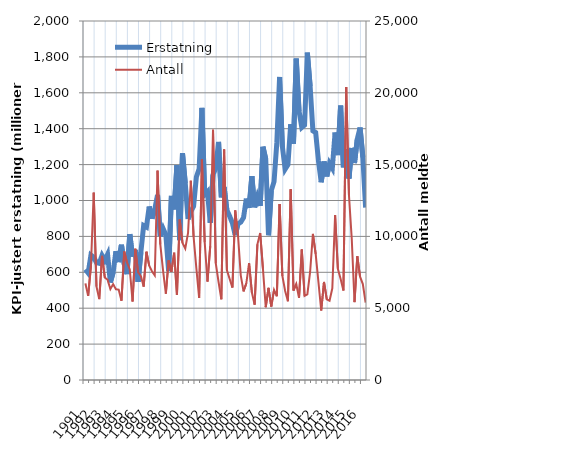
| Category | Erstatning |
|---|---|
| 1991.0 | 616.265 |
| nan | 596.168 |
| nan | 695.61 |
| nan | 683.787 |
| 1992.0 | 654.264 |
| nan | 650.086 |
| nan | 694.114 |
| nan | 666.281 |
| 1993.0 | 699.623 |
| nan | 543.342 |
| nan | 599.474 |
| nan | 717.435 |
| 1994.0 | 656.906 |
| nan | 753.578 |
| nan | 645.873 |
| nan | 589.696 |
| 1995.0 | 812.756 |
| nan | 686.966 |
| nan | 724.85 |
| nan | 546.639 |
| 1996.0 | 712.208 |
| nan | 860.409 |
| nan | 851.828 |
| nan | 966.551 |
| 1997.0 | 899.002 |
| nan | 950.697 |
| nan | 1030.685 |
| nan | 801.293 |
| 1998.0 | 844.15 |
| nan | 808.933 |
| nan | 606.267 |
| nan | 1025.385 |
| 1999.0 | 950.061 |
| nan | 1196.371 |
| nan | 779.416 |
| nan | 1263.603 |
| 2000.0 | 1095.813 |
| nan | 896.795 |
| nan | 937.576 |
| nan | 967.604 |
| 2001.0 | 1131.039 |
| nan | 1177.33 |
| nan | 1515.944 |
| nan | 1033.131 |
| 2002.0 | 1049.331 |
| nan | 875.783 |
| nan | 1142.763 |
| nan | 1182.003 |
| 2003.0 | 1326.27 |
| nan | 1018.063 |
| nan | 1074.673 |
| nan | 946.444 |
| 2004.0 | 912.797 |
| nan | 873.195 |
| nan | 807.5 |
| nan | 869.948 |
| 2005.0 | 879.375 |
| nan | 904.695 |
| nan | 1010.665 |
| nan | 959.076 |
| 2006.0 | 1135.665 |
| nan | 961.881 |
| nan | 1020.075 |
| nan | 970.376 |
| 2007.0 | 1299.486 |
| nan | 1231.02 |
| nan | 806.52 |
| nan | 1055.097 |
| 2008.0 | 1105.097 |
| nan | 1322.141 |
| nan | 1688.162 |
| nan | 1300.465 |
| 2009.0 | 1174.208 |
| nan | 1198.81 |
| nan | 1424.867 |
| nan | 1316.505 |
| 2010.0 | 1790.678 |
| nan | 1498.539 |
| nan | 1406.97 |
| nan | 1420.541 |
| 2011.0 | 1823.95 |
| nan | 1636.407 |
| nan | 1388.709 |
| nan | 1378.57 |
| 2012.0 | 1221.062 |
| nan | 1101.625 |
| nan | 1217.401 |
| nan | 1134.299 |
| 2013.0 | 1206.888 |
| nan | 1180.135 |
| nan | 1378.612 |
| nan | 1252.996 |
| 2014.0 | 1528.653 |
| nan | 1185.046 |
| nan | 1285.623 |
| nan | 1122.101 |
| 2015.0 | 1292.782 |
| nan | 1208.47 |
| nan | 1342.065 |
| nan | 1406.226 |
| 2016.0 | 1241.425 |
| nan | 960.598 |